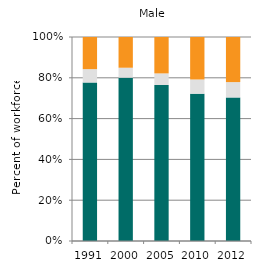
| Category | Agriculture | Industry | Services |
|---|---|---|---|
| 1991.0 | 77.689 | 6.556 | 15.755 |
| 2000.0 | 80.06 | 4.881 | 15.059 |
| 2005.0 | 76.464 | 5.693 | 17.843 |
| 2010.0 | 72.24 | 6.936 | 20.824 |
| 2012.0 | 70.374 | 7.519 | 22.107 |